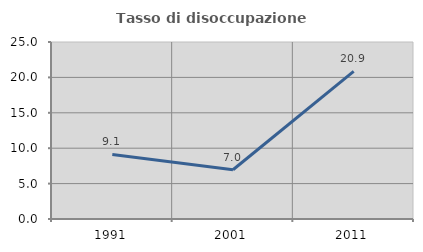
| Category | Tasso di disoccupazione giovanile  |
|---|---|
| 1991.0 | 9.122 |
| 2001.0 | 6.952 |
| 2011.0 | 20.863 |